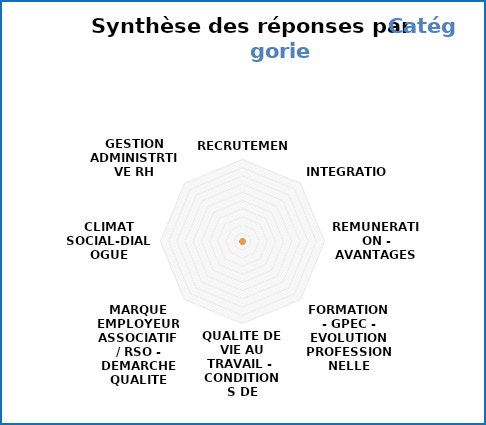
| Category | Series 0 |
|---|---|
| RECRUTEMENT | 0 |
| INTEGRATION | 0 |
| REMUNERATION - AVANTAGES | 0 |
| FORMATION - GPEC - EVOLUTION PROFESSIONNELLE | 0 |
| QUALITE DE VIE AU TRAVAIL - 
CONDITIONS DE TRAVAIL | 0 |
| MARQUE EMPLOYEUR ASSOCIATIF / RSO - DEMARCHE QUALITE | 0 |
| CLIMAT SOCIAL-DIALOGUE SOCIAL | 0 |
| GESTION ADMINISTRTIVE RH | 0 |